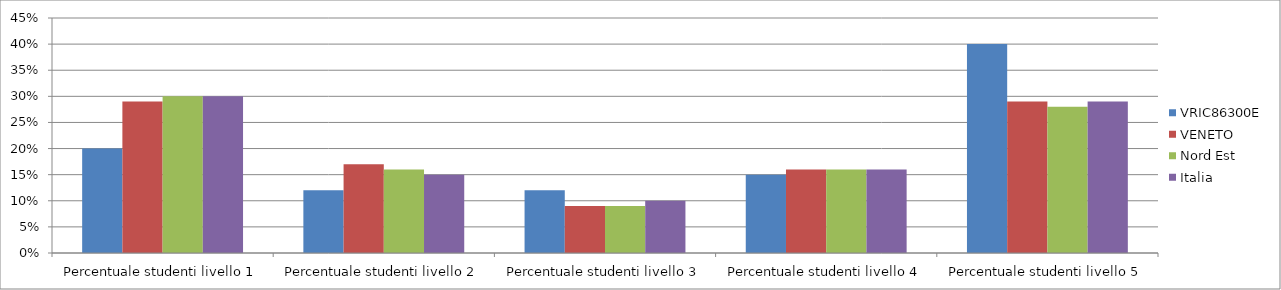
| Category | VRIC86300E | VENETO  | Nord Est | Italia |
|---|---|---|---|---|
| Percentuale studenti livello 1 | 0.2 | 0.29 | 0.3 | 0.3 |
| Percentuale studenti livello 2 | 0.12 | 0.17 | 0.16 | 0.15 |
| Percentuale studenti livello 3 | 0.12 | 0.09 | 0.09 | 0.1 |
| Percentuale studenti livello 4 | 0.15 | 0.16 | 0.16 | 0.16 |
| Percentuale studenti livello 5 | 0.4 | 0.29 | 0.28 | 0.29 |